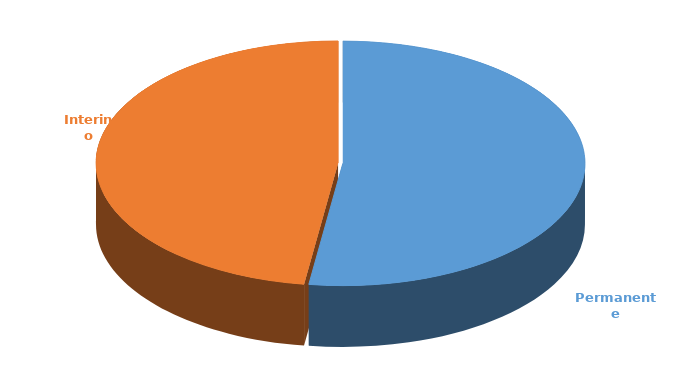
| Category | Cantidad |
|---|---|
| Permanente | 3095 |
| Interino | 2829 |